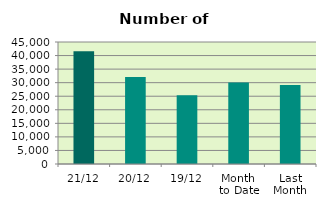
| Category | Series 0 |
|---|---|
| 21/12 | 41580 |
| 20/12 | 32084 |
| 19/12 | 25394 |
| Month 
to Date | 30085.067 |
| Last
Month | 29125.182 |